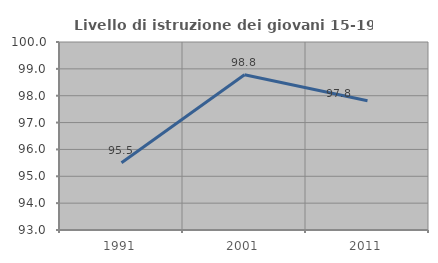
| Category | Livello di istruzione dei giovani 15-19 anni |
|---|---|
| 1991.0 | 95.506 |
| 2001.0 | 98.78 |
| 2011.0 | 97.814 |